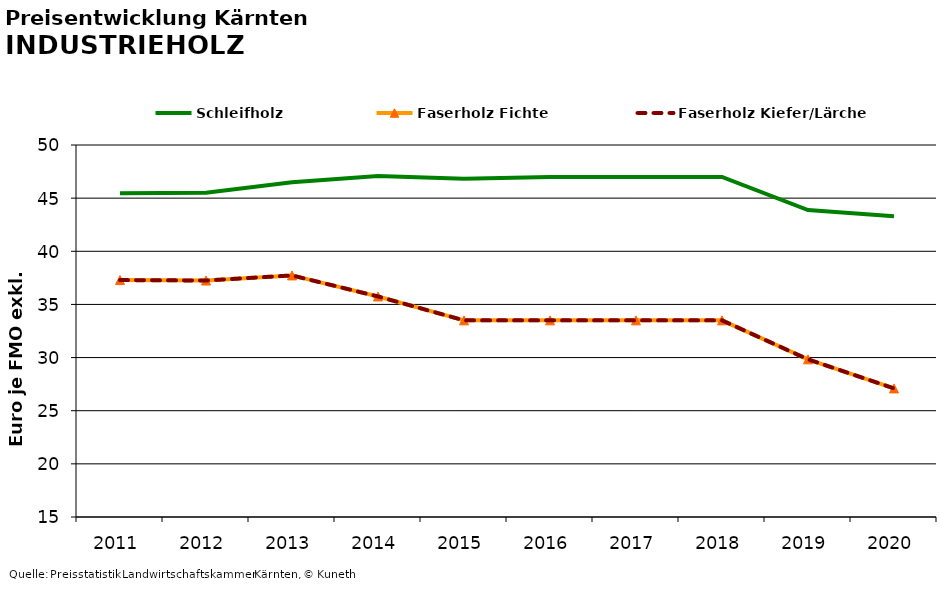
| Category | Schleifholz | Faserholz Fichte | Faserholz Kiefer/Lärche |
|---|---|---|---|
| 2011.0 | 45.458 | 37.292 | 37.292 |
| 2012.0 | 45.5 | 37.25 | 37.25 |
| 2013.0 | 46.5 | 37.729 | 37.729 |
| 2014.0 | 47.083 | 35.75 | 35.75 |
| 2015.0 | 46.833 | 33.5 | 33.5 |
| 2016.0 | 47 | 33.5 | 33.5 |
| 2017.0 | 47 | 33.5 | 33.5 |
| 2018.0 | 47 | 33.5 | 33.5 |
| 2019.0 | 43.875 | 29.833 | 29.833 |
| 2020.0 | 43.3 | 27.1 | 27.1 |